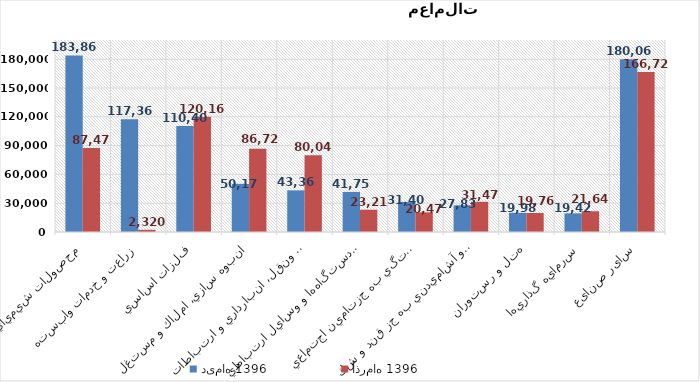
| Category | دی‌ماه 1396 | آذر‌ماه 1396 |
|---|---|---|
| محصولات شيميايي | 183868 | 87475 |
| زراعت و خدمات وابسته | 117369 | 2320 |
| فلزات اساسي | 110401 | 120164 |
| انبوه سازي، املاك و مستغلات | 50174 | 86723 |
| حمل ونقل، انبارداري و ارتباطات | 43369 | 80045 |
| ساخت دستگاه‌ها و وسايل ارتباطي | 41750 | 23216 |
| بيمه وصندوق بازنشستگي به جزتامين اجتماعي | 31402 | 20472 |
| محصولات غذايي و آشاميدني به جز قند و شكر | 27836 | 31478 |
| هتل و رستوران | 19989 | 19764 |
| سرمايه گذاريها | 19426 | 21646 |
| سایر صنایع | 180066 | 166723 |